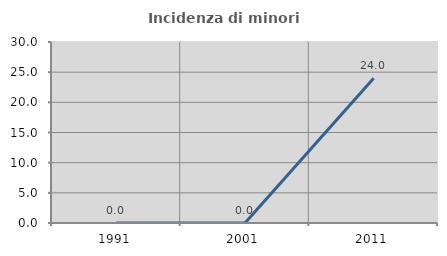
| Category | Incidenza di minori stranieri |
|---|---|
| 1991.0 | 0 |
| 2001.0 | 0 |
| 2011.0 | 24 |